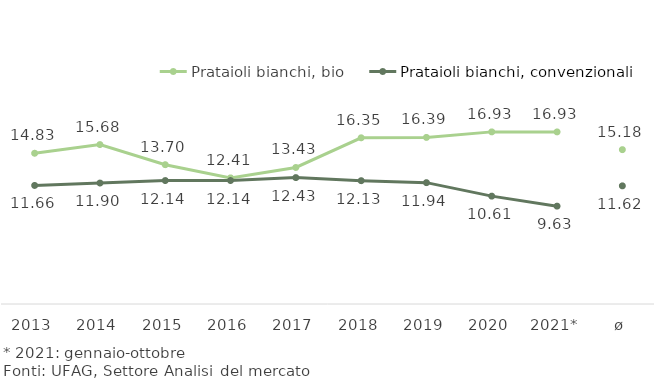
| Category | Prataioli bianchi, bio | Prataioli bianchi, convenzionali |
|---|---|---|
| 2013 | 14.828 | 11.661 |
| 2014 | 15.682 | 11.897 |
| 2015 | 13.703 | 12.14 |
| 2016 | 12.406 | 12.144 |
| 2017 | 13.428 | 12.432 |
| 2018 | 16.348 | 12.131 |
| 2019 | 16.387 | 11.936 |
| 2020 | 16.93 | 10.61 |
| 2021* | 16.928 | 9.625 |
| ø | 15.182 | 11.619 |